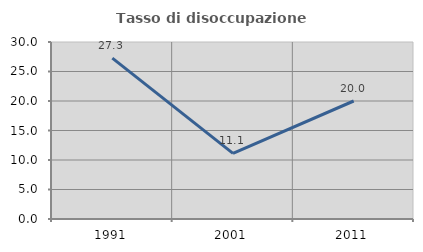
| Category | Tasso di disoccupazione giovanile  |
|---|---|
| 1991.0 | 27.273 |
| 2001.0 | 11.111 |
| 2011.0 | 20 |